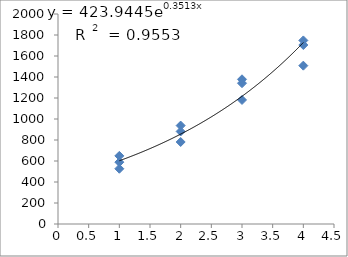
| Category | Series 0 |
|---|---|
| 1.0 | 526.319 |
| 1.0 | 648.779 |
| 1.0 | 588.852 |
| 2.0 | 937.298 |
| 2.0 | 881.507 |
| 2.0 | 781.082 |
| 3.0 | 1181.299 |
| 3.0 | 1378.183 |
| 3.0 | 1340.934 |
| 4.0 | 1507.952 |
| 4.0 | 1748.35 |
| 4.0 | 1704.641 |